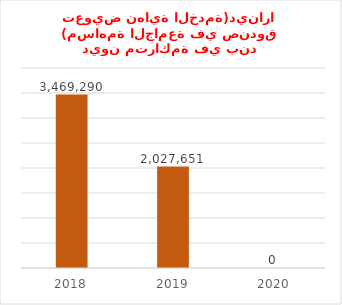
| Category | ديون متراكمة في بند (مساهمة الجامعة في صندوق تعويض نهاية الخدمة)دينارا |
|---|---|
| 2018.0 | 3469290 |
| 2019.0 | 2027651 |
| 2020.0 | 0 |